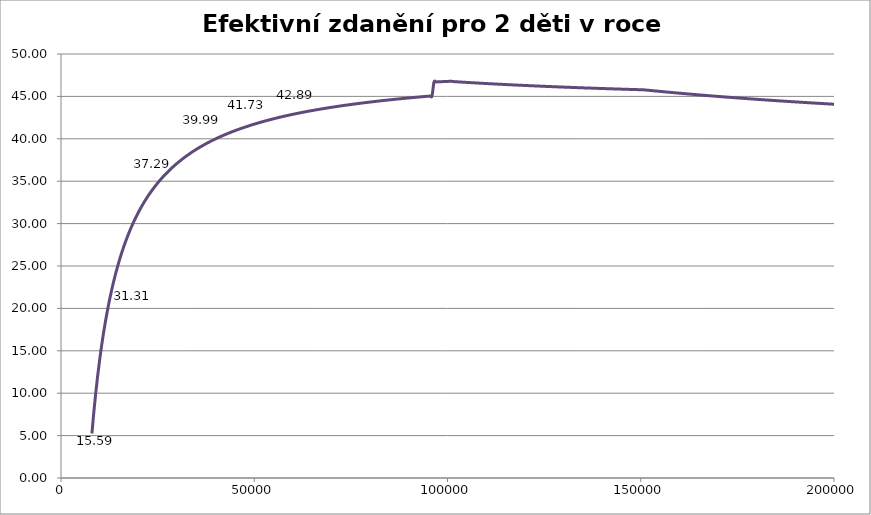
| Category | Efektivní zdanění 2014 |
|---|---|
| 8000.0 | 5.245 |
| 8500.0 | 7.8 |
| 9000.0 | 10.071 |
| 9500.0 | 12.103 |
| 10000.0 | 13.932 |
| 10500.0 | 15.587 |
| 11000.0 | 17.091 |
| 11500.0 | 18.464 |
| 12000.0 | 19.723 |
| 12500.0 | 20.882 |
| 13000.0 | 21.951 |
| 13500.0 | 22.941 |
| 14000.0 | 23.86 |
| 14500.0 | 24.716 |
| 15000.0 | 25.514 |
| 15500.0 | 26.262 |
| 16000.0 | 26.962 |
| 16500.0 | 27.62 |
| 17000.0 | 28.24 |
| 17500.0 | 28.824 |
| 18000.0 | 29.375 |
| 18500.0 | 29.897 |
| 19000.0 | 30.391 |
| 19500.0 | 30.86 |
| 20000.0 | 31.306 |
| 20500.0 | 31.729 |
| 21000.0 | 32.133 |
| 21500.0 | 32.518 |
| 22000.0 | 32.885 |
| 22500.0 | 33.236 |
| 23000.0 | 33.572 |
| 23500.0 | 33.893 |
| 24000.0 | 34.201 |
| 24500.0 | 34.497 |
| 25000.0 | 34.78 |
| 25500.0 | 35.053 |
| 26000.0 | 35.315 |
| 26500.0 | 35.567 |
| 27000.0 | 35.81 |
| 27500.0 | 36.044 |
| 28000.0 | 36.27 |
| 28500.0 | 36.487 |
| 29000.0 | 36.697 |
| 29500.0 | 36.901 |
| 30000.0 | 37.097 |
| 30500.0 | 37.287 |
| 31000.0 | 37.47 |
| 31500.0 | 37.648 |
| 32000.0 | 37.821 |
| 32500.0 | 37.988 |
| 33000.0 | 38.15 |
| 33500.0 | 38.307 |
| 34000.0 | 38.459 |
| 34500.0 | 38.608 |
| 35000.0 | 38.751 |
| 35500.0 | 38.891 |
| 36000.0 | 39.027 |
| 36500.0 | 39.159 |
| 37000.0 | 39.288 |
| 37500.0 | 39.413 |
| 38000.0 | 39.535 |
| 38500.0 | 39.654 |
| 39000.0 | 39.77 |
| 39500.0 | 39.882 |
| 40000.0 | 39.992 |
| 40500.0 | 40.1 |
| 41000.0 | 40.204 |
| 41500.0 | 40.306 |
| 42000.0 | 40.406 |
| 42500.0 | 40.503 |
| 43000.0 | 40.599 |
| 43500.0 | 40.691 |
| 44000.0 | 40.782 |
| 44500.0 | 40.871 |
| 45000.0 | 40.958 |
| 45500.0 | 41.043 |
| 46000.0 | 41.126 |
| 46500.0 | 41.207 |
| 47000.0 | 41.286 |
| 47500.0 | 41.364 |
| 48000.0 | 41.44 |
| 48500.0 | 41.515 |
| 49000.0 | 41.588 |
| 49500.0 | 41.66 |
| 50000.0 | 41.73 |
| 50500.0 | 41.799 |
| 51000.0 | 41.866 |
| 51500.0 | 41.932 |
| 52000.0 | 41.997 |
| 52500.0 | 42.061 |
| 53000.0 | 42.123 |
| 53500.0 | 42.184 |
| 54000.0 | 42.245 |
| 54500.0 | 42.304 |
| 55000.0 | 42.362 |
| 55500.0 | 42.418 |
| 56000.0 | 42.474 |
| 56500.0 | 42.529 |
| 57000.0 | 42.583 |
| 57500.0 | 42.636 |
| 58000.0 | 42.688 |
| 58500.0 | 42.74 |
| 59000.0 | 42.79 |
| 59500.0 | 42.839 |
| 60000.0 | 42.888 |
| 60500.0 | 42.936 |
| 61000.0 | 42.983 |
| 61500.0 | 43.029 |
| 62000.0 | 43.075 |
| 62500.0 | 43.12 |
| 63000.0 | 43.164 |
| 63500.0 | 43.207 |
| 64000.0 | 43.25 |
| 64500.0 | 43.292 |
| 65000.0 | 43.334 |
| 65500.0 | 43.374 |
| 66000.0 | 43.415 |
| 66500.0 | 43.454 |
| 67000.0 | 43.493 |
| 67500.0 | 43.532 |
| 68000.0 | 43.569 |
| 68500.0 | 43.607 |
| 69000.0 | 43.643 |
| 69500.0 | 43.68 |
| 70000.0 | 43.715 |
| 70500.0 | 43.751 |
| 71000.0 | 43.785 |
| 71500.0 | 43.82 |
| 72000.0 | 43.853 |
| 72500.0 | 43.887 |
| 73000.0 | 43.919 |
| 73500.0 | 43.952 |
| 74000.0 | 43.984 |
| 74500.0 | 44.015 |
| 75000.0 | 44.046 |
| 75500.0 | 44.077 |
| 76000.0 | 44.107 |
| 76500.0 | 44.137 |
| 77000.0 | 44.167 |
| 77500.0 | 44.196 |
| 78000.0 | 44.224 |
| 78500.0 | 44.253 |
| 79000.0 | 44.281 |
| 79500.0 | 44.309 |
| 80000.0 | 44.336 |
| 80500.0 | 44.363 |
| 81000.0 | 44.389 |
| 81500.0 | 44.416 |
| 82000.0 | 44.442 |
| 82500.0 | 44.467 |
| 83000.0 | 44.493 |
| 83500.0 | 44.518 |
| 84000.0 | 44.543 |
| 84500.0 | 44.567 |
| 85000.0 | 44.591 |
| 85500.0 | 44.615 |
| 86000.0 | 44.639 |
| 86500.0 | 44.662 |
| 87000.0 | 44.685 |
| 87500.0 | 44.708 |
| 88000.0 | 44.731 |
| 88500.0 | 44.753 |
| 89000.0 | 44.775 |
| 89500.0 | 44.797 |
| 90000.0 | 44.818 |
| 90500.0 | 44.84 |
| 91000.0 | 44.861 |
| 91500.0 | 44.882 |
| 92000.0 | 44.902 |
| 92500.0 | 44.923 |
| 93000.0 | 44.943 |
| 93500.0 | 44.963 |
| 94000.0 | 44.983 |
| 94500.0 | 45.002 |
| 95000.0 | 45.022 |
| 95500.0 | 45.041 |
| 96000.0 | 45.06 |
| 96500.0 | 46.697 |
| 97000.0 | 46.708 |
| 97500.0 | 46.718 |
| 98000.0 | 46.728 |
| 98500.0 | 46.738 |
| 99000.0 | 46.747 |
| 99500.0 | 46.757 |
| 100000.0 | 46.767 |
| 100500.0 | 46.776 |
| 101000.0 | 46.786 |
| 101500.0 | 46.749 |
| 102000.0 | 46.734 |
| 102500.0 | 46.72 |
| 103000.0 | 46.706 |
| 103500.0 | 46.691 |
| 104000.0 | 46.677 |
| 104500.0 | 46.664 |
| 105000.0 | 46.65 |
| 105500.0 | 46.636 |
| 106000.0 | 46.623 |
| 106500.0 | 46.609 |
| 107000.0 | 46.596 |
| 107500.0 | 46.583 |
| 108000.0 | 46.57 |
| 108500.0 | 46.557 |
| 109000.0 | 46.544 |
| 109500.0 | 46.532 |
| 110000.0 | 46.519 |
| 110500.0 | 46.507 |
| 111000.0 | 46.494 |
| 111500.0 | 46.482 |
| 112000.0 | 46.47 |
| 112500.0 | 46.458 |
| 113000.0 | 46.446 |
| 113500.0 | 46.434 |
| 114000.0 | 46.423 |
| 114500.0 | 46.411 |
| 115000.0 | 46.4 |
| 115500.0 | 46.388 |
| 116000.0 | 46.377 |
| 116500.0 | 46.366 |
| 117000.0 | 46.355 |
| 117500.0 | 46.344 |
| 118000.0 | 46.333 |
| 118500.0 | 46.322 |
| 119000.0 | 46.311 |
| 119500.0 | 46.301 |
| 120000.0 | 46.29 |
| 120500.0 | 46.28 |
| 121000.0 | 46.269 |
| 121500.0 | 46.259 |
| 122000.0 | 46.249 |
| 122500.0 | 46.239 |
| 123000.0 | 46.229 |
| 123500.0 | 46.219 |
| 124000.0 | 46.209 |
| 124500.0 | 46.199 |
| 125000.0 | 46.19 |
| 125500.0 | 46.18 |
| 126000.0 | 46.17 |
| 126500.0 | 46.161 |
| 127000.0 | 46.152 |
| 127500.0 | 46.142 |
| 128000.0 | 46.133 |
| 128500.0 | 46.124 |
| 129000.0 | 46.115 |
| 129500.0 | 46.106 |
| 130000.0 | 46.097 |
| 130500.0 | 46.088 |
| 131000.0 | 46.079 |
| 131500.0 | 46.07 |
| 132000.0 | 46.061 |
| 132500.0 | 46.053 |
| 133000.0 | 46.044 |
| 133500.0 | 46.036 |
| 134000.0 | 46.027 |
| 134500.0 | 46.019 |
| 135000.0 | 46.011 |
| 135500.0 | 46.002 |
| 136000.0 | 45.994 |
| 136500.0 | 45.986 |
| 137000.0 | 45.978 |
| 137500.0 | 45.97 |
| 138000.0 | 45.962 |
| 138500.0 | 45.954 |
| 139000.0 | 45.946 |
| 139500.0 | 45.938 |
| 140000.0 | 45.931 |
| 140500.0 | 45.923 |
| 141000.0 | 45.915 |
| 141500.0 | 45.908 |
| 142000.0 | 45.9 |
| 142500.0 | 45.893 |
| 143000.0 | 45.886 |
| 143500.0 | 45.878 |
| 144000.0 | 45.871 |
| 144500.0 | 45.864 |
| 145000.0 | 45.856 |
| 145500.0 | 45.849 |
| 146000.0 | 45.842 |
| 146500.0 | 45.835 |
| 147000.0 | 45.828 |
| 147500.0 | 45.821 |
| 148000.0 | 45.814 |
| 148500.0 | 45.807 |
| 149000.0 | 45.8 |
| 149500.0 | 45.794 |
| 150000.0 | 45.787 |
| 150500.0 | 45.78 |
| 151000.0 | 45.768 |
| 151500.0 | 45.745 |
| 152000.0 | 45.722 |
| 152500.0 | 45.7 |
| 153000.0 | 45.678 |
| 153500.0 | 45.655 |
| 154000.0 | 45.633 |
| 154500.0 | 45.612 |
| 155000.0 | 45.59 |
| 155500.0 | 45.568 |
| 156000.0 | 45.547 |
| 156500.0 | 45.525 |
| 157000.0 | 45.504 |
| 157500.0 | 45.483 |
| 158000.0 | 45.462 |
| 158500.0 | 45.441 |
| 159000.0 | 45.421 |
| 159500.0 | 45.4 |
| 160000.0 | 45.38 |
| 160500.0 | 45.359 |
| 161000.0 | 45.339 |
| 161500.0 | 45.319 |
| 162000.0 | 45.299 |
| 162500.0 | 45.28 |
| 163000.0 | 45.26 |
| 163500.0 | 45.24 |
| 164000.0 | 45.221 |
| 164500.0 | 45.202 |
| 165000.0 | 45.182 |
| 165500.0 | 45.163 |
| 166000.0 | 45.144 |
| 166500.0 | 45.125 |
| 167000.0 | 45.107 |
| 167500.0 | 45.088 |
| 168000.0 | 45.07 |
| 168500.0 | 45.051 |
| 169000.0 | 45.033 |
| 169500.0 | 45.015 |
| 170000.0 | 44.997 |
| 170500.0 | 44.979 |
| 171000.0 | 44.961 |
| 171500.0 | 44.943 |
| 172000.0 | 44.925 |
| 172500.0 | 44.908 |
| 173000.0 | 44.89 |
| 173500.0 | 44.873 |
| 174000.0 | 44.856 |
| 174500.0 | 44.839 |
| 175000.0 | 44.822 |
| 175500.0 | 44.805 |
| 176000.0 | 44.788 |
| 176500.0 | 44.771 |
| 177000.0 | 44.754 |
| 177500.0 | 44.738 |
| 178000.0 | 44.721 |
| 178500.0 | 44.705 |
| 179000.0 | 44.689 |
| 179500.0 | 44.672 |
| 180000.0 | 44.656 |
| 180500.0 | 44.64 |
| 181000.0 | 44.624 |
| 181500.0 | 44.608 |
| 182000.0 | 44.593 |
| 182500.0 | 44.577 |
| 183000.0 | 44.561 |
| 183500.0 | 44.546 |
| 184000.0 | 44.53 |
| 184500.0 | 44.515 |
| 185000.0 | 44.5 |
| 185500.0 | 44.485 |
| 186000.0 | 44.469 |
| 186500.0 | 44.454 |
| 187000.0 | 44.44 |
| 187500.0 | 44.425 |
| 188000.0 | 44.41 |
| 188500.0 | 44.395 |
| 189000.0 | 44.381 |
| 189500.0 | 44.366 |
| 190000.0 | 44.352 |
| 190500.0 | 44.337 |
| 191000.0 | 44.323 |
| 191500.0 | 44.309 |
| 192000.0 | 44.294 |
| 192500.0 | 44.28 |
| 193000.0 | 44.266 |
| 193500.0 | 44.252 |
| 194000.0 | 44.238 |
| 194500.0 | 44.225 |
| 195000.0 | 44.211 |
| 195500.0 | 44.197 |
| 196000.0 | 44.184 |
| 196500.0 | 44.17 |
| 197000.0 | 44.157 |
| 197500.0 | 44.143 |
| 198000.0 | 44.13 |
| 198500.0 | 44.117 |
| 199000.0 | 44.104 |
| 199500.0 | 44.09 |
| 200000.0 | 44.077 |